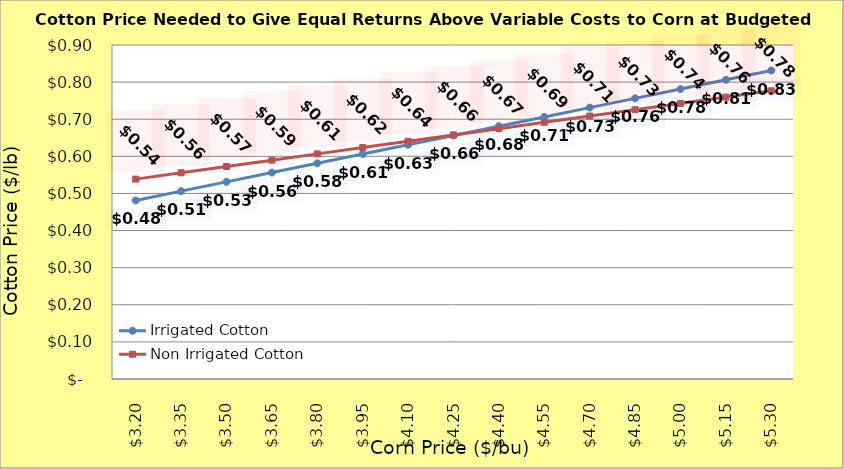
| Category | Irrigated Cotton | Non Irrigated Cotton |
|---|---|---|
| 3.2 | 0.481 | 0.539 |
| 3.35 | 0.506 | 0.556 |
| 3.5 | 0.531 | 0.573 |
| 3.65 | 0.556 | 0.59 |
| 3.8 | 0.581 | 0.607 |
| 3.9499999999999997 | 0.606 | 0.624 |
| 4.1 | 0.631 | 0.641 |
| 4.25 | 0.656 | 0.658 |
| 4.4 | 0.681 | 0.675 |
| 4.550000000000001 | 0.706 | 0.692 |
| 4.700000000000001 | 0.731 | 0.709 |
| 4.850000000000001 | 0.756 | 0.726 |
| 5.000000000000002 | 0.781 | 0.743 |
| 5.150000000000002 | 0.806 | 0.76 |
| 5.3000000000000025 | 0.831 | 0.777 |